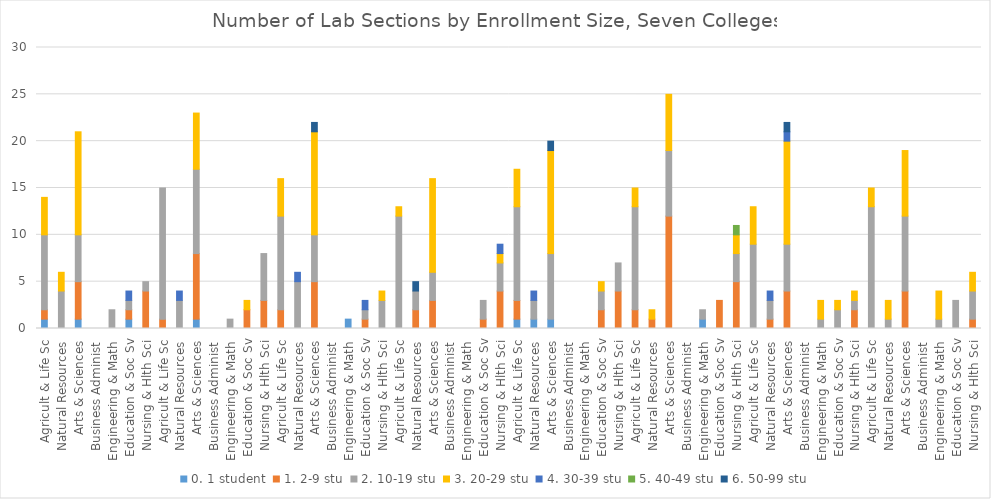
| Category | 0. 1 student | 1. 2-9 stu | 2. 10-19 stu | 3. 20-29 stu | 4. 30-39 stu | 5. 40-49 stu | 6. 50-99 stu |
|---|---|---|---|---|---|---|---|
| 0 | 1 | 1 | 8 | 4 | 0 | 0 | 0 |
| 1 | 0 | 0 | 4 | 2 | 0 | 0 | 0 |
| 2 | 1 | 4 | 5 | 11 | 0 | 0 | 0 |
| 3 | 0 | 0 | 0 | 0 | 0 | 0 | 0 |
| 4 | 0 | 0 | 2 | 0 | 0 | 0 | 0 |
| 5 | 1 | 1 | 1 | 0 | 1 | 0 | 0 |
| 6 | 0 | 4 | 1 | 0 | 0 | 0 | 0 |
| 7 | 0 | 1 | 14 | 0 | 0 | 0 | 0 |
| 8 | 0 | 0 | 3 | 0 | 1 | 0 | 0 |
| 9 | 1 | 7 | 9 | 6 | 0 | 0 | 0 |
| 10 | 0 | 0 | 0 | 0 | 0 | 0 | 0 |
| 11 | 0 | 0 | 1 | 0 | 0 | 0 | 0 |
| 12 | 0 | 2 | 0 | 1 | 0 | 0 | 0 |
| 13 | 0 | 3 | 5 | 0 | 0 | 0 | 0 |
| 14 | 0 | 2 | 10 | 4 | 0 | 0 | 0 |
| 15 | 0 | 0 | 5 | 0 | 1 | 0 | 0 |
| 16 | 0 | 5 | 5 | 11 | 0 | 0 | 1 |
| 17 | 0 | 0 | 0 | 0 | 0 | 0 | 0 |
| 18 | 1 | 0 | 0 | 0 | 0 | 0 | 0 |
| 19 | 0 | 1 | 1 | 0 | 1 | 0 | 0 |
| 20 | 0 | 0 | 3 | 1 | 0 | 0 | 0 |
| 21 | 0 | 0 | 12 | 1 | 0 | 0 | 0 |
| 22 | 0 | 2 | 2 | 0 | 0 | 0 | 1 |
| 23 | 0 | 3 | 3 | 10 | 0 | 0 | 0 |
| 24 | 0 | 0 | 0 | 0 | 0 | 0 | 0 |
| 25 | 0 | 0 | 0 | 0 | 0 | 0 | 0 |
| 26 | 0 | 1 | 2 | 0 | 0 | 0 | 0 |
| 27 | 0 | 4 | 3 | 1 | 1 | 0 | 0 |
| 28 | 1 | 2 | 10 | 4 | 0 | 0 | 0 |
| 29 | 1 | 0 | 2 | 0 | 1 | 0 | 0 |
| 30 | 1 | 0 | 7 | 11 | 0 | 0 | 1 |
| 31 | 0 | 0 | 0 | 0 | 0 | 0 | 0 |
| 32 | 0 | 0 | 0 | 0 | 0 | 0 | 0 |
| 33 | 0 | 2 | 2 | 1 | 0 | 0 | 0 |
| 34 | 0 | 4 | 3 | 0 | 0 | 0 | 0 |
| 35 | 0 | 2 | 11 | 2 | 0 | 0 | 0 |
| 36 | 0 | 1 | 0 | 1 | 0 | 0 | 0 |
| 37 | 0 | 12 | 7 | 6 | 0 | 0 | 0 |
| 38 | 0 | 0 | 0 | 0 | 0 | 0 | 0 |
| 39 | 1 | 0 | 1 | 0 | 0 | 0 | 0 |
| 40 | 0 | 3 | 0 | 0 | 0 | 0 | 0 |
| 41 | 0 | 5 | 3 | 2 | 0 | 1 | 0 |
| 42 | 0 | 0 | 9 | 4 | 0 | 0 | 0 |
| 43 | 0 | 1 | 2 | 0 | 1 | 0 | 0 |
| 44 | 0 | 4 | 5 | 11 | 1 | 0 | 1 |
| 45 | 0 | 0 | 0 | 0 | 0 | 0 | 0 |
| 46 | 0 | 0 | 1 | 2 | 0 | 0 | 0 |
| 47 | 0 | 0 | 2 | 1 | 0 | 0 | 0 |
| 48 | 0 | 2 | 1 | 1 | 0 | 0 | 0 |
| 49 | 0 | 0 | 13 | 2 | 0 | 0 | 0 |
| 50 | 0 | 0 | 1 | 2 | 0 | 0 | 0 |
| 51 | 0 | 4 | 8 | 7 | 0 | 0 | 0 |
| 52 | 0 | 0 | 0 | 0 | 0 | 0 | 0 |
| 53 | 0 | 0 | 1 | 3 | 0 | 0 | 0 |
| 54 | 0 | 0 | 3 | 0 | 0 | 0 | 0 |
| 55 | 0 | 1 | 3 | 2 | 0 | 0 | 0 |